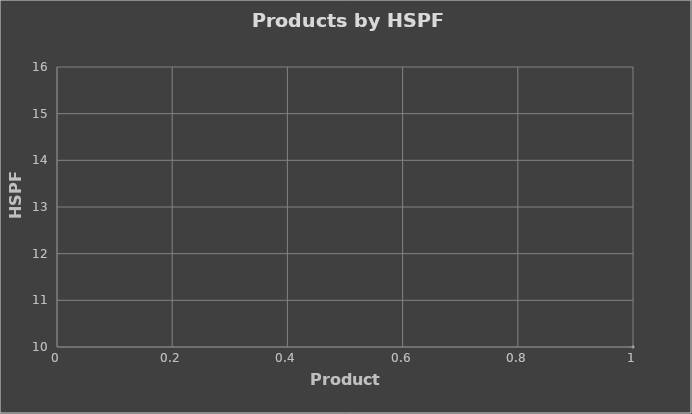
| Category | Series 0 |
|---|---|
| 0 | 10 |
| 1 | 10 |
| 2 | 10 |
| 3 | 10 |
| 4 | 10 |
| 5 | 10 |
| 6 | 10 |
| 7 | 10 |
| 8 | 10 |
| 9 | 10 |
| 10 | 10 |
| 11 | 10 |
| 12 | 10 |
| 13 | 10 |
| 14 | 10 |
| 15 | 10 |
| 16 | 10 |
| 17 | 10 |
| 18 | 10 |
| 19 | 10 |
| 20 | 10 |
| 21 | 10 |
| 22 | 10 |
| 23 | 10 |
| 24 | 10 |
| 25 | 10 |
| 26 | 10 |
| 27 | 10 |
| 28 | 10 |
| 29 | 10.5 |
| 30 | 10 |
| 31 | 10 |
| 32 | 10 |
| 33 | 10 |
| 34 | 12 |
| 35 | 10.5 |
| 36 | 10.5 |
| 37 | 10.5 |
| 38 | 10.5 |
| 39 | 10.5 |
| 40 | 11 |
| 41 | 11 |
| 42 | 11 |
| 43 | 11 |
| 44 | 11 |
| 45 | 11.5 |
| 46 | 11.5 |
| 47 | 11 |
| 48 | 11.5 |
| 49 | 11.5 |
| 50 | 10 |
| 51 | 10 |
| 52 | 10 |
| 53 | 10.5 |
| 54 | 10.5 |
| 55 | 10.5 |
| 56 | 10.5 |
| 57 | 10.5 |
| 58 | 10.5 |
| 59 | 11 |
| 60 | 11 |
| 61 | 11 |
| 62 | 10.5 |
| 63 | 10.5 |
| 64 | 10.5 |
| 65 | 10.5 |
| 66 | 10.5 |
| 67 | 11 |
| 68 | 11 |
| 69 | 11 |
| 70 | 11 |
| 71 | 11 |
| 72 | 11 |
| 73 | 11 |
| 74 | 11 |
| 75 | 11 |
| 76 | 11 |
| 77 | 11 |
| 78 | 11 |
| 79 | 11 |
| 80 | 11 |
| 81 | 11 |
| 82 | 11 |
| 83 | 11.5 |
| 84 | 11.5 |
| 85 | 11.5 |
| 86 | 11.5 |
| 87 | 11.5 |
| 88 | 11.5 |
| 89 | 11.5 |
| 90 | 11.5 |
| 91 | 11.5 |
| 92 | 11.5 |
| 93 | 11.5 |
| 94 | 11.5 |
| 95 | 10.5 |
| 96 | 10.5 |
| 97 | 10.5 |
| 98 | 10.5 |
| 99 | 10.5 |
| 100 | 10.5 |
| 101 | 11 |
| 102 | 11 |
| 103 | 11 |
| 104 | 11 |
| 105 | 11 |
| 106 | 11 |
| 107 | 10.5 |
| 108 | 10.5 |
| 109 | 10.5 |
| 110 | 10.5 |
| 111 | 11 |
| 112 | 11 |
| 113 | 11 |
| 114 | 11 |
| 115 | 11 |
| 116 | 11 |
| 117 | 11 |
| 118 | 13 |
| 119 | 10.5 |
| 120 | 10.5 |
| 121 | 11.5 |
| 122 | 11 |
| 123 | 11.5 |
| 124 | 11.5 |
| 125 | 11.5 |
| 126 | 11.5 |
| 127 | 11 |
| 128 | 11 |
| 129 | 11 |
| 130 | 10.5 |
| 131 | 10.5 |
| 132 | 11 |
| 133 | 11 |
| 134 | 11 |
| 135 | 11 |
| 136 | 11 |
| 137 | 11.5 |
| 138 | 10.5 |
| 139 | 10.5 |
| 140 | 10.5 |
| 141 | 10.5 |
| 142 | 11 |
| 143 | 11 |
| 144 | 10.5 |
| 145 | 11 |
| 146 | 11 |
| 147 | 11 |
| 148 | 11.5 |
| 149 | 11.5 |
| 150 | 11.5 |
| 151 | 11.5 |
| 152 | 11.5 |
| 153 | 11 |
| 154 | 11.5 |
| 155 | 11.5 |
| 156 | 11 |
| 157 | 11.5 |
| 158 | 11.5 |
| 159 | 10.5 |
| 160 | 10.5 |
| 161 | 11 |
| 162 | 11 |
| 163 | 11 |
| 164 | 11 |
| 165 | 11 |
| 166 | 11 |
| 167 | 10.5 |
| 168 | 11 |
| 169 | 11 |
| 170 | 10.5 |
| 171 | 10.5 |
| 172 | 10.5 |
| 173 | 11 |
| 174 | 11 |
| 175 | 10.5 |
| 176 | 11 |
| 177 | 11 |
| 178 | 11 |
| 179 | 11.5 |
| 180 | 11.5 |
| 181 | 12 |
| 182 | 11 |
| 183 | 10.5 |
| 184 | 11 |
| 185 | 11 |
| 186 | 10.5 |
| 187 | 10.5 |
| 188 | 10.5 |
| 189 | 12 |
| 190 | 15 |
| 191 | 14 |
| 192 | 12 |
| 193 | 13 |
| 194 | 12.5 |
| 195 | 13 |
| 196 | 10.3 |
| 197 | 12 |
| 198 | 11.2 |
| 199 | 10.5 |
| 200 | 10.5 |
| 201 | 10.5 |
| 202 | 10.3 |
| 203 | 10.3 |
| 204 | 10.5 |
| 205 | 10.5 |
| 206 | 10.2 |
| 207 | 10.2 |
| 208 | 10 |
| 209 | 10 |
| 210 | 10 |
| 211 | 10 |
| 212 | 12 |
| 213 | 10.5 |
| 214 | 10.5 |
| 215 | 10.5 |
| 216 | 10.5 |
| 217 | 10.5 |
| 218 | 11 |
| 219 | 11 |
| 220 | 11 |
| 221 | 11 |
| 222 | 11 |
| 223 | 11.5 |
| 224 | 11.5 |
| 225 | 11 |
| 226 | 11.5 |
| 227 | 11.5 |
| 228 | 10 |
| 229 | 10 |
| 230 | 10 |
| 231 | 10.5 |
| 232 | 10.5 |
| 233 | 10.5 |
| 234 | 10.5 |
| 235 | 10.5 |
| 236 | 10.5 |
| 237 | 11 |
| 238 | 11 |
| 239 | 11 |
| 240 | 10.5 |
| 241 | 10.5 |
| 242 | 10.5 |
| 243 | 10.5 |
| 244 | 10.5 |
| 245 | 11 |
| 246 | 11 |
| 247 | 11 |
| 248 | 11 |
| 249 | 11 |
| 250 | 11 |
| 251 | 11 |
| 252 | 11 |
| 253 | 11 |
| 254 | 11 |
| 255 | 11 |
| 256 | 11 |
| 257 | 11 |
| 258 | 11 |
| 259 | 11 |
| 260 | 11 |
| 261 | 11.5 |
| 262 | 11.5 |
| 263 | 11.5 |
| 264 | 11.5 |
| 265 | 11.5 |
| 266 | 11.5 |
| 267 | 11.5 |
| 268 | 11.5 |
| 269 | 11.5 |
| 270 | 11.5 |
| 271 | 11.5 |
| 272 | 11.5 |
| 273 | 10.5 |
| 274 | 10.5 |
| 275 | 10.5 |
| 276 | 10.5 |
| 277 | 10.5 |
| 278 | 10.5 |
| 279 | 11 |
| 280 | 11 |
| 281 | 11 |
| 282 | 11 |
| 283 | 11 |
| 284 | 11 |
| 285 | 10.5 |
| 286 | 10.5 |
| 287 | 10.5 |
| 288 | 10.5 |
| 289 | 11 |
| 290 | 11 |
| 291 | 11 |
| 292 | 11 |
| 293 | 11 |
| 294 | 11 |
| 295 | 11 |
| 296 | 11 |
| 297 | 13 |
| 298 | 10.5 |
| 299 | 10.5 |
| 300 | 11.5 |
| 301 | 11 |
| 302 | 11.5 |
| 303 | 11.5 |
| 304 | 11.5 |
| 305 | 11.5 |
| 306 | 11 |
| 307 | 11 |
| 308 | 11 |
| 309 | 10.5 |
| 310 | 10.5 |
| 311 | 11 |
| 312 | 11 |
| 313 | 11 |
| 314 | 11 |
| 315 | 11 |
| 316 | 11.5 |
| 317 | 10.5 |
| 318 | 10.5 |
| 319 | 10.5 |
| 320 | 10.5 |
| 321 | 11 |
| 322 | 11 |
| 323 | 10.5 |
| 324 | 11 |
| 325 | 11 |
| 326 | 11 |
| 327 | 11.5 |
| 328 | 11.5 |
| 329 | 11.5 |
| 330 | 11.5 |
| 331 | 11.5 |
| 332 | 11 |
| 333 | 11.5 |
| 334 | 11.5 |
| 335 | 11 |
| 336 | 11.5 |
| 337 | 11.5 |
| 338 | 10.5 |
| 339 | 10.5 |
| 340 | 11 |
| 341 | 11 |
| 342 | 11 |
| 343 | 11 |
| 344 | 11 |
| 345 | 11 |
| 346 | 10.5 |
| 347 | 11 |
| 348 | 11 |
| 349 | 10.5 |
| 350 | 10.5 |
| 351 | 10.5 |
| 352 | 11 |
| 353 | 11 |
| 354 | 10.5 |
| 355 | 11 |
| 356 | 11 |
| 357 | 11 |
| 358 | 11.5 |
| 359 | 11.5 |
| 360 | 12 |
| 361 | 11 |
| 362 | 10.5 |
| 363 | 11 |
| 364 | 11 |
| 365 | 10.5 |
| 366 | 10.5 |
| 367 | 10.5 |
| 368 | 12 |
| 369 | 11 |
| 370 | 12.5 |
| 371 | 10.5 |
| 372 | 15 |
| 373 | 14 |
| 374 | 10.3 |
| 375 | 10.3 |
| 376 | 10.3 |
| 377 | 11.2 |
| 378 | 12 |
| 379 | 10.3 |
| 380 | 10.5 |
| 381 | 11 |
| 382 | 10.55 |
| 383 | 10 |
| 384 | 12.5 |
| 385 | 12.5 |
| 386 | 11.6 |
| 387 | 11 |
| 388 | 10.6 |
| 389 | 10.7 |
| 390 | 12.5 |
| 391 | 12.5 |
| 392 | 11.3 |
| 393 | 12 |
| 394 | 11.7 |
| 395 | 12.5 |
| 396 | 10.3 |
| 397 | 12.5 |
| 398 | 11.7 |
| 399 | 11.2 |
| 400 | 11 |
| 401 | 10.1 |
| 402 | 10 |
| 403 | 10 |
| 404 | 10 |
| 405 | 10 |
| 406 | 10 |
| 407 | 10.5 |
| 408 | 10.1 |
| 409 | 10 |
| 410 | 11.2 |
| 411 | 12 |
| 412 | 11.5 |
| 413 | 11 |
| 414 | 11 |
| 415 | 11 |
| 416 | 11 |
| 417 | 10.6 |
| 418 | 10.2 |
| 419 | 12.5 |
| 420 | 12 |
| 421 | 13 |
| 422 | 12.2 |
| 423 | 12.2 |
| 424 | 11.5 |